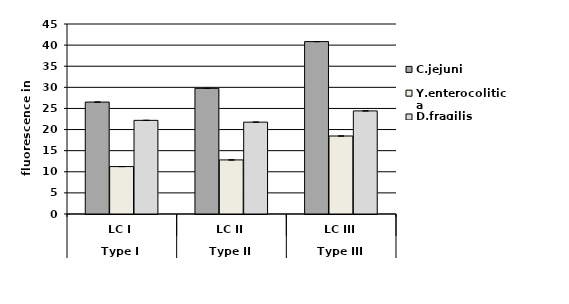
| Category | C.jejuni | Y.enterocolitica | D.fragilis |
|---|---|---|---|
| 0 | 26.51 | 11.23 | 22.18 |
| 1 | 29.758 | 12.811 | 21.755 |
| 2 | 40.833 | 18.47 | 24.42 |